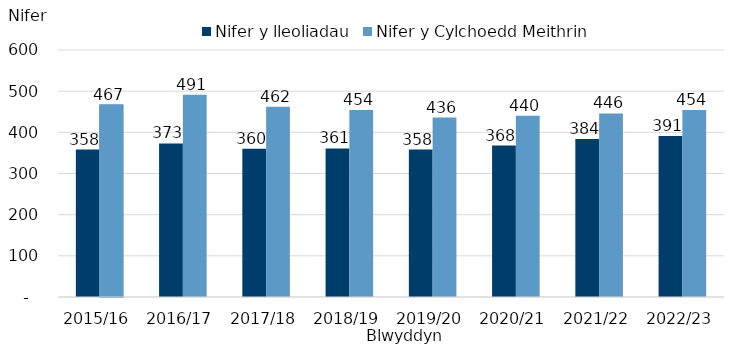
| Category | Nifer y lleoliadau | Nifer y Cylchoedd Meithrin |
|---|---|---|
| 2015/16 | 358 | 467 |
| 2016/17 | 373 | 491 |
| 2017/18 | 360 | 462 |
| 2018/19 | 361 | 454 |
| 2019/20 | 358 | 436 |
| 2020/21 | 368 | 440 |
| 2021/22 | 384 | 446 |
| 2022/23 | 391 | 454 |